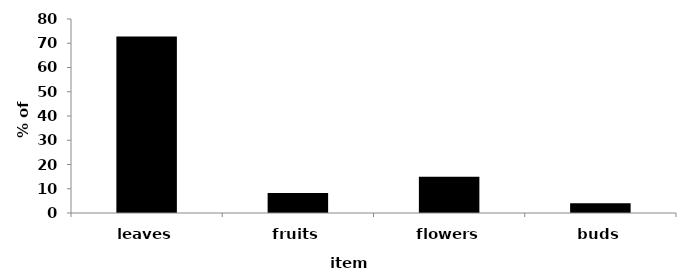
| Category | Series 0 |
|---|---|
| leaves | 72.83 |
| fruits | 8.2 |
| flowers | 14.95 |
| buds | 4.02 |